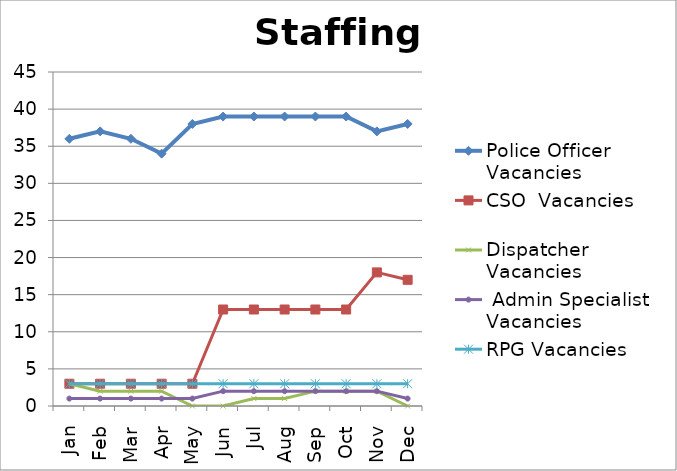
| Category | Police Officer Vacancies | CSO  Vacancies | Dispatcher Vacancies |  Admin Specialist Vacancies | RPG Vacancies |
|---|---|---|---|---|---|
| Jan | 36 | 3 | 3 | 1 | 3 |
| Feb | 37 | 3 | 2 | 1 | 3 |
| Mar | 36 | 3 | 2 | 1 | 3 |
| Apr | 34 | 3 | 2 | 1 | 3 |
| May | 38 | 3 | 0 | 1 | 3 |
| Jun | 39 | 13 | 0 | 2 | 3 |
| Jul | 39 | 13 | 1 | 2 | 3 |
| Aug | 39 | 13 | 1 | 2 | 3 |
| Sep | 39 | 13 | 2 | 2 | 3 |
| Oct | 39 | 13 | 2 | 2 | 3 |
| Nov | 37 | 18 | 2 | 2 | 3 |
| Dec | 38 | 17 | 0 | 1 | 3 |